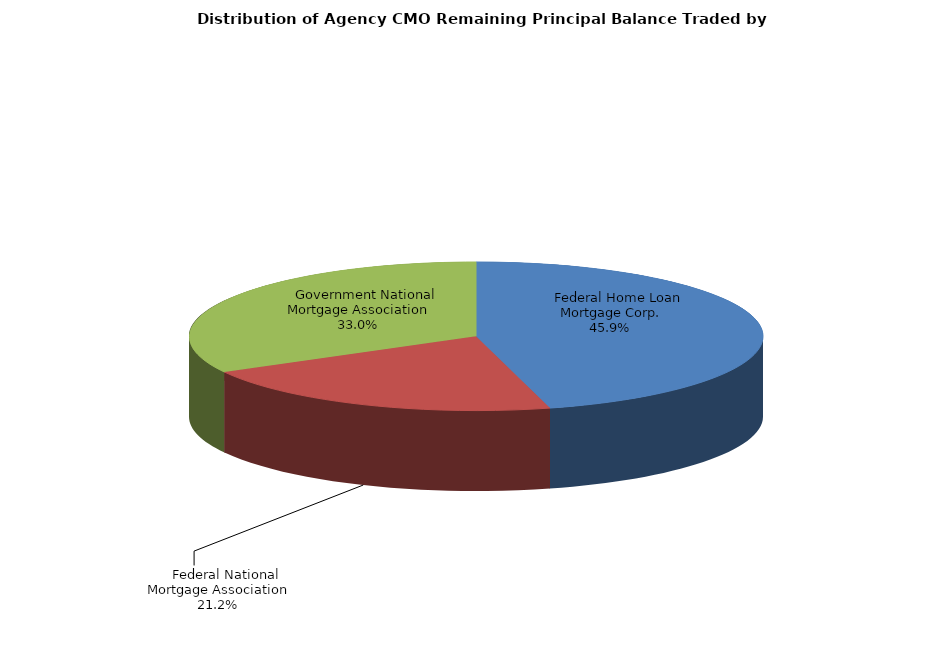
| Category | Series 0 |
|---|---|
|     Federal Home Loan Mortgage Corp. | 2177904682.258 |
|     Federal National Mortgage Association | 1004634768.068 |
|     Government National Mortgage Association | 1567492901.866 |